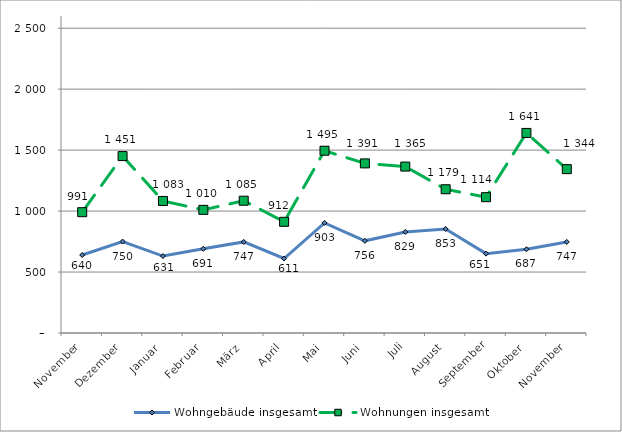
| Category | Wohngebäude insgesamt | Wohnungen insgesamt |
|---|---|---|
| November | 640 | 991 |
| Dezember | 750 | 1451 |
| Januar | 631 | 1083 |
| Februar | 691 | 1010 |
| März | 747 | 1085 |
| April | 611 | 912 |
| Mai | 903 | 1495 |
| Juni | 756 | 1391 |
| Juli | 829 | 1365 |
| August | 853 | 1179 |
| September | 651 | 1114 |
| Oktober | 687 | 1641 |
| November | 747 | 1344 |